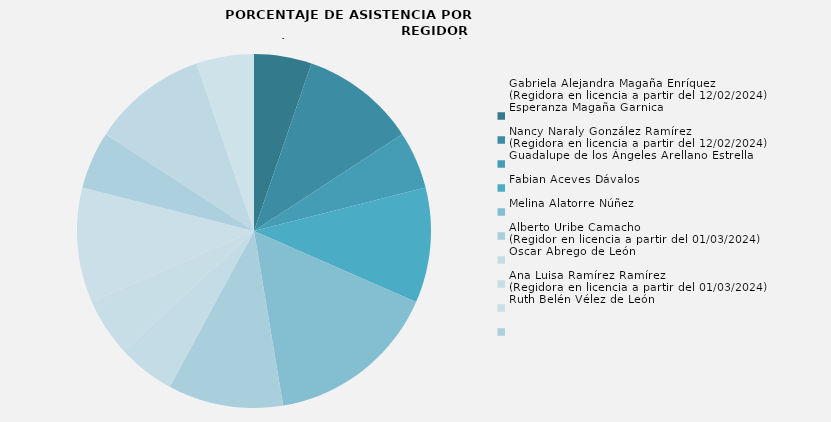
| Category | Gabriela Alejandra Magaña Enríquez
(Regidora en licencia a partir del 12/02/2024) |
|---|---|
| Gabriela Alejandra Magaña Enríquez
(Regidora en licencia a partir del 12/02/2024) | 33.333 |
| Esperanza Magaña Garnica | 66.667 |
| Nancy Naraly González Ramírez
(Regidora en licencia a partir del 12/02/2024) | 33.333 |
| Guadalupe de los Ángeles Arellano Estrella | 66.667 |
| Fabian Aceves Dávalos | 100 |
| Melina Alatorre Núñez | 66.667 |
| Alberto Uribe Camacho
(Regidor en licencia a partir del 01/03/2024) | 33.333 |
| Oscar Abrego de León | 33.333 |
| Ana Luisa Ramírez Ramírez
(Regidora en licencia a partir del 01/03/2024) | 66.667 |
| Ruth Belén Vélez de León | 33.333 |
| Mariana Hernández González
(Regidora en licencia a partir del 01/03/2024) | 66.667 |
| Eloy Francisco Aquino Herrán | 33.333 |